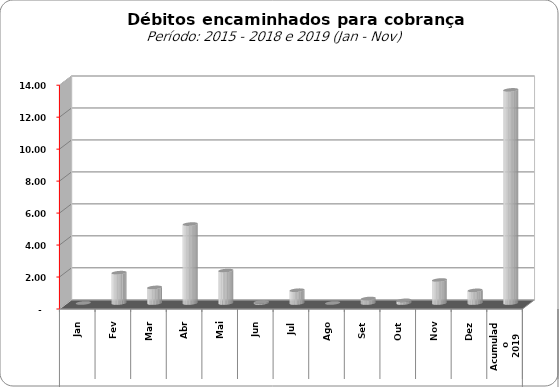
| Category |  3.309.443,02   3.859.728,44   11.181.928,25   7.600.526,01   31.248.623,50   9.830.198,34   20.083.556,95   23.931.734,08   -     1.897.202,11   974.309,37   4.937.737,42   2.030.400,14   66.339,49   799.707,68   -     280.398,44   165.655,52   1.436.970 |
|---|---|
| 0 | 0 |
| 1 | 1897202.11 |
| 2 | 974309.37 |
| 3 | 4937737.42 |
| 4 | 2030400.14 |
| 5 | 66339.49 |
| 6 | 799707.68 |
| 7 | 0 |
| 8 | 280398.44 |
| 9 | 165655.52 |
| 10 | 1436970.96 |
| 11 | 790591.66 |
| 12 | 13330853.03 |